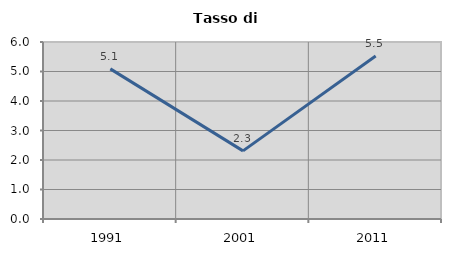
| Category | Tasso di disoccupazione   |
|---|---|
| 1991.0 | 5.09 |
| 2001.0 | 2.309 |
| 2011.0 | 5.525 |